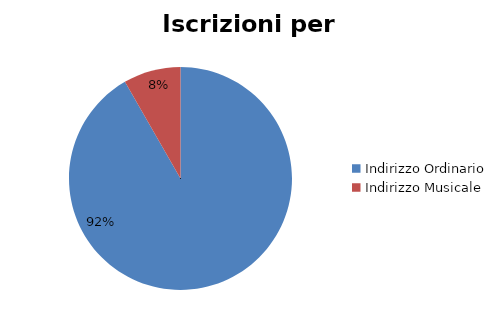
| Category | #REF! |
|---|---|
| Indirizzo Ordinario | 35489 |
| Indirizzo Musicale | 3214 |